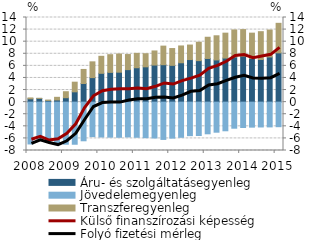
| Category | Áru- és szolgáltatásegyenleg | Jövedelemegyenleg | Transzferegyenleg |
|---|---|---|---|
| 2008.0 | 0.547 | -6.918 | 0.145 |
| 2008.0 | 0.613 | -6.375 | 0.016 |
| 2008.0 | 0.278 | -6.687 | 0.057 |
| 2008.0 | 0.359 | -6.936 | 0.438 |
| 2009.0 | 0.731 | -6.96 | 0.991 |
| 2009.0 | 1.705 | -6.966 | 1.597 |
| 2009.0 | 3.081 | -6.394 | 2.328 |
| 2009.0 | 4.056 | -5.703 | 2.608 |
| 2010.0 | 4.769 | -5.764 | 2.812 |
| 2010.0 | 4.923 | -5.79 | 2.925 |
| 2010.0 | 4.955 | -5.811 | 3.006 |
| 2010.0 | 5.378 | -5.755 | 2.494 |
| 2011.0 | 5.69 | -5.809 | 2.377 |
| 2011.0 | 5.84 | -5.881 | 2.167 |
| 2011.0 | 6.134 | -5.931 | 2.331 |
| 2011.0 | 6.192 | -6.168 | 3.073 |
| 2012.0 | 6.087 | -5.953 | 2.777 |
| 2012.0 | 6.511 | -5.815 | 2.782 |
| 2012.0 | 7.044 | -5.544 | 2.399 |
| 2012.0 | 6.866 | -5.523 | 3.044 |
| 2013.0 | 7.224 | -5.237 | 3.508 |
| 2013.0 | 6.978 | -4.973 | 3.997 |
| 2013.0 | 7.291 | -4.737 | 4.119 |
| 2013.0 | 7.471 | -4.312 | 4.471 |
| 2014.0 | 7.615 | -4.196 | 4.383 |
| 2014.0 | 7.221 | -4.135 | 4.191 |
| 2014.0 | 7.05 | -4.108 | 4.605 |
| 2014.0 | 7.469 | -4.097 | 4.455 |
| 2015.0 | 8.151 | -4.062 | 4.886 |